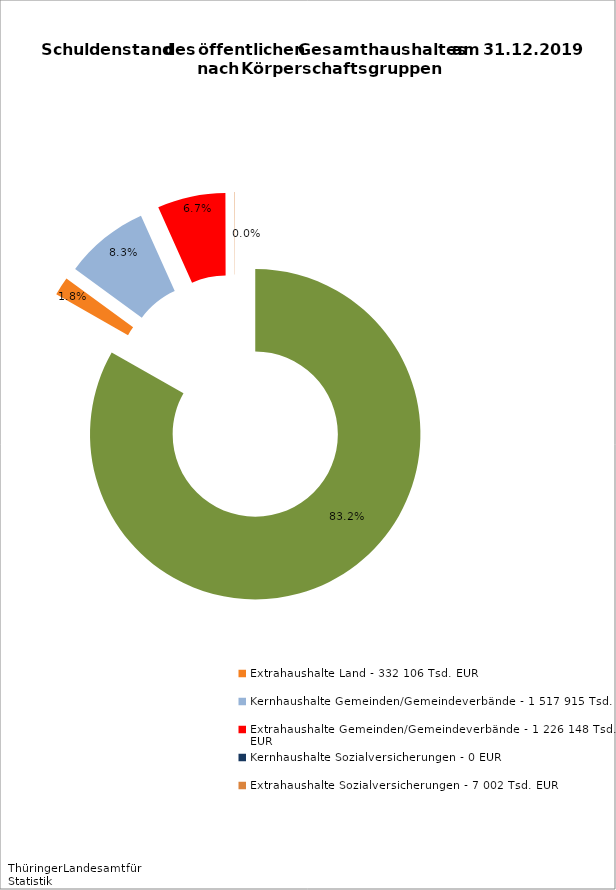
| Category | Series 0 |
|---|---|
| Kernhaushalt Land - 15 308 518 Tsd. EUR | 15308518.254 |
| Extrahaushalte Land - 332 106 Tsd. EUR | 332105.855 |
| Kernhaushalte Gemeinden/Gemeindeverbände - 1 517 915 Tsd. EUR | 1517914.934 |
| Extrahaushalte Gemeinden/Gemeindeverbände - 1 226 148 Tsd. EUR | 1226148.306 |
| Kernhaushalte Sozialversicherungen - 0 EUR | 0 |
| Extrahaushalte Sozialversicherungen - 7 002 Tsd. EUR | 7002.144 |